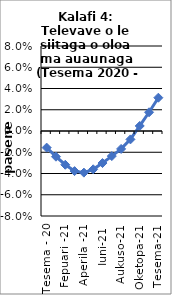
| Category | All items - 12 month rolling year average changes |
|---|---|
| Tesema - 20 | -0.016 |
| Ianuari - 21 | -0.024 |
| Fepuari -21 | -0.032 |
| Mati-21 | -0.038 |
| Aperila -21 | -0.039 |
| Me-21 | -0.036 |
| Iuni-21 | -0.03 |
| Iulai-21 | -0.024 |
| Aukuso-21 | -0.017 |
| Setema-21 | -0.008 |
| Oketopa-21 | 0.005 |
| Novema-21 | 0.018 |
| Tesema-21 | 0.031 |